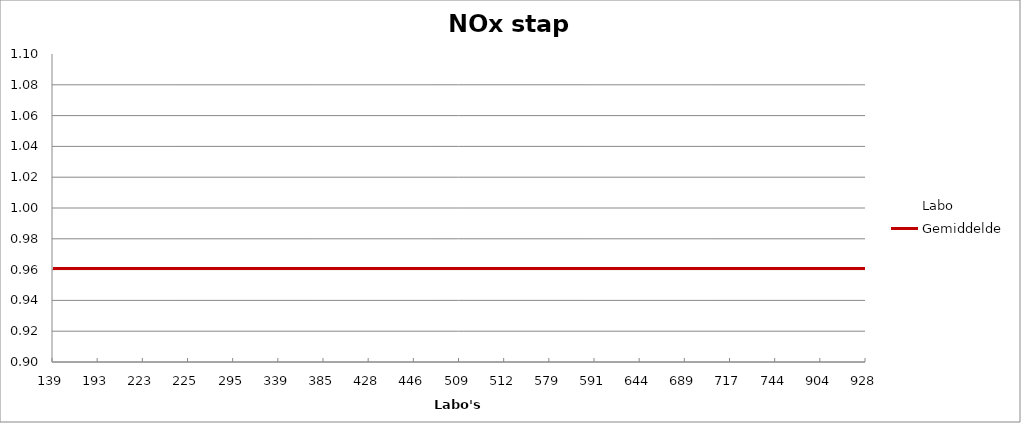
| Category | Labo | Gemiddelde |
|---|---|---|
| 139.0 | 0.943 | 0.961 |
| 193.0 | 0.969 | 0.961 |
| 223.0 | 0.979 | 0.961 |
| 225.0 | 0.979 | 0.961 |
| 295.0 | 0.954 | 0.961 |
| 339.0 | 1.005 | 0.961 |
| 385.0 | 0.959 | 0.961 |
| 428.0 | 1.03 | 0.961 |
| 446.0 | 0.933 | 0.961 |
| 509.0 | 0.933 | 0.961 |
| 512.0 | 0.928 | 0.961 |
| 579.0 | 0.989 | 0.961 |
| 591.0 | 0.989 | 0.961 |
| 644.0 | 1.005 | 0.961 |
| 689.0 | 0.943 | 0.961 |
| 717.0 | 0.923 | 0.961 |
| 744.0 | 0.902 | 0.961 |
| 904.0 | 0.964 | 0.961 |
| 928.0 | 0.933 | 0.961 |